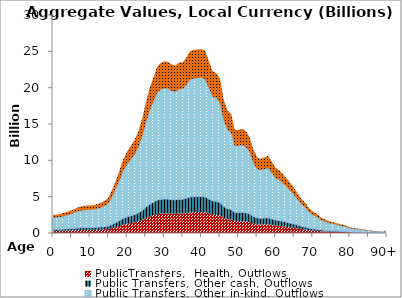
| Category | PublicTransfers,  Health, Outflows | Public Transfers, Other cash, Outflows | Public Transfers, Other in-kind, Outflows | Public Transfers, Education, Outflows |
|---|---|---|---|---|
| 0 | 284.603 | 209.832 | 1611.461 | 389.54 |
|  | 288.101 | 212.412 | 1631.269 | 394.328 |
| 2 | 297.945 | 219.669 | 1687.007 | 407.801 |
| 3 | 316.492 | 233.343 | 1792.019 | 433.186 |
| 4 | 335.912 | 247.661 | 1901.977 | 459.766 |
| 5 | 358.889 | 264.602 | 2032.08 | 491.216 |
| 6 | 382.258 | 281.831 | 2164.396 | 523.201 |
| 7 | 406.733 | 299.877 | 2302.978 | 556.701 |
| 8 | 424.155 | 312.721 | 2401.623 | 580.546 |
| 9 | 429.875 | 316.939 | 2434.013 | 588.376 |
| 10 | 430.425 | 317.344 | 2437.125 | 589.128 |
| 11 | 437.332 | 322.437 | 2476.235 | 598.582 |
| 12 | 454.648 | 335.203 | 2574.278 | 622.282 |
| 13 | 475.57 | 350.628 | 2692.74 | 650.918 |
| 14 | 509.269 | 375.475 | 2883.554 | 697.044 |
| 15 | 555.485 | 409.549 | 3145.234 | 760.3 |
| 16 | 690.148 | 508.833 | 3907.71 | 944.614 |
| 17 | 829.13 | 611.301 | 4694.646 | 1134.84 |
| 18 | 996.613 | 734.784 | 5642.959 | 1364.077 |
| 19 | 1167.398 | 860.7 | 6609.968 | 1597.833 |
| 20 | 1279.411 | 943.285 | 7244.199 | 1751.146 |
| 21 | 1372.277 | 1011.754 | 7770.02 | 1878.253 |
| 22 | 1461.666 | 1077.658 | 8276.154 | 2000.601 |
| 23 | 1596.965 | 1177.412 | 9042.235 | 2185.786 |
| 24 | 1790.884 | 1320.384 | 10140.228 | 2451.205 |
| 25 | 2036.722 | 1501.636 | 11532.197 | 2787.687 |
| 26 | 2266.735 | 1671.22 | 12834.564 | 3102.509 |
| 27 | 2432.804 | 1793.66 | 13774.87 | 3329.81 |
| 28 | 2597.852 | 1915.347 | 14709.396 | 3555.714 |
| 29 | 2670.934 | 1969.229 | 15123.197 | 3655.742 |
| 30 | 2693.993 | 1986.23 | 15253.759 | 3687.303 |
| 31 | 2686.416 | 1980.643 | 15210.858 | 3676.932 |
| 32 | 2643.509 | 1949.009 | 14967.912 | 3618.205 |
| 33 | 2628.512 | 1937.952 | 14882.994 | 3597.678 |
| 34 | 2677.827 | 1974.311 | 15162.225 | 3665.176 |
| 35 | 2682.799 | 1977.976 | 15190.375 | 3671.981 |
| 36 | 2760.335 | 2035.142 | 15629.393 | 3778.105 |
| 37 | 2858.695 | 2107.661 | 16186.325 | 3912.733 |
| 38 | 2875.027 | 2119.703 | 16278.799 | 3935.087 |
| 39 | 2882.058 | 2124.886 | 16318.609 | 3944.71 |
| 40 | 2886.708 | 2128.314 | 16344.934 | 3951.073 |
| 41 | 2862.18 | 2110.23 | 16206.054 | 3917.502 |
| 42 | 2694.533 | 1986.628 | 15256.817 | 3688.042 |
| 43 | 2541.958 | 1874.137 | 14392.915 | 3479.21 |
| 44 | 2510.74 | 1851.121 | 14216.154 | 3436.482 |
| 45 | 2415.744 | 1781.082 | 13678.273 | 3306.459 |
| 46 | 2093.419 | 1543.438 | 11853.224 | 2865.289 |
| 47 | 1924.036 | 1418.555 | 10894.156 | 2633.453 |
| 48 | 1866.381 | 1376.047 | 10567.703 | 2554.539 |
| 49 | 1616.21 | 1191.601 | 9151.202 | 2212.127 |
| 50 | 1618.617 | 1193.375 | 9164.829 | 2215.421 |
| 51 | 1633.618 | 1204.435 | 9249.77 | 2235.954 |
| 52 | 1600.798 | 1180.238 | 9063.938 | 2191.033 |
| 53 | 1499.099 | 1105.257 | 8488.107 | 2051.837 |
| 54 | 1310.901 | 966.502 | 7422.501 | 1794.247 |
| 55 | 1187.56 | 875.566 | 6724.129 | 1625.429 |
| 56 | 1165.01 | 858.94 | 6596.446 | 1594.564 |
| 57 | 1190.291 | 877.579 | 6739.593 | 1629.167 |
| 58 | 1208.478 | 890.988 | 6842.569 | 1654.06 |
| 59 | 1113.806 | 821.188 | 6306.521 | 1524.48 |
| 60 | 1020.124 | 752.118 | 5776.083 | 1396.257 |
| 61 | 986.455 | 727.294 | 5585.442 | 1350.173 |
| 62 | 919.079 | 677.62 | 5203.954 | 1257.956 |
| 63 | 852.457 | 628.5 | 4826.726 | 1166.768 |
| 64 | 780.418 | 575.387 | 4418.835 | 1068.168 |
| 65 | 705.798 | 520.371 | 3996.322 | 966.034 |
| 66 | 616.392 | 454.454 | 3490.095 | 843.663 |
| 67 | 531.598 | 391.937 | 3009.98 | 727.605 |
| 68 | 472.672 | 348.492 | 2676.333 | 646.952 |
| 69 | 388.804 | 286.658 | 2201.462 | 532.161 |
| 70 | 337.637 | 248.933 | 1911.748 | 462.128 |
| 71 | 302.465 | 223.002 | 1712.598 | 413.988 |
| 72 | 254.347 | 187.525 | 1440.149 | 348.128 |
| 73 | 219.539 | 161.862 | 1243.06 | 300.486 |
| 74 | 194.71 | 143.556 | 1102.473 | 266.502 |
| 75 | 173.588 | 127.983 | 982.88 | 237.592 |
| 76 | 162.576 | 119.864 | 920.527 | 222.52 |
| 77 | 144.561 | 106.582 | 818.526 | 197.863 |
| 78 | 129.41 | 95.412 | 732.74 | 177.126 |
| 79 | 115.503 | 85.158 | 653.996 | 158.091 |
| 80 | 91.368 | 67.364 | 517.338 | 125.056 |
| 81 | 76.938 | 56.725 | 435.631 | 105.305 |
| 82 | 69.259 | 51.063 | 392.153 | 94.796 |
| 83 | 63.536 | 46.844 | 359.75 | 86.963 |
| 84 | 53.264 | 39.27 | 301.588 | 72.903 |
| 85 | 41.942 | 30.923 | 237.482 | 57.407 |
| 86 | 33.447 | 24.66 | 189.382 | 45.779 |
| 87 | 27.413 | 20.211 | 155.218 | 37.521 |
| 88 | 22.145 | 16.327 | 125.388 | 30.31 |
| 89 | 17.403 | 12.831 | 98.541 | 23.82 |
| 90+ | 49.661 | 36.614 | 281.187 | 67.971 |